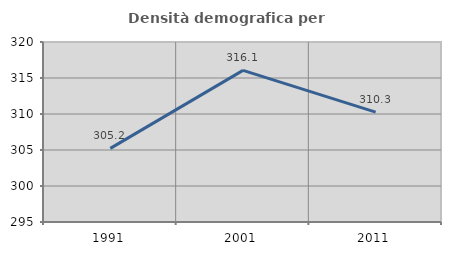
| Category | Densità demografica |
|---|---|
| 1991.0 | 305.226 |
| 2001.0 | 316.064 |
| 2011.0 | 310.267 |